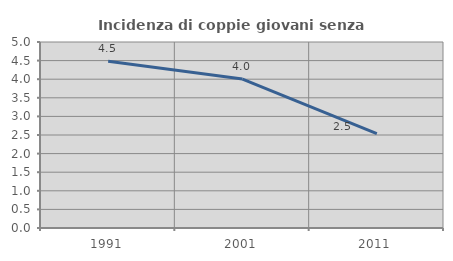
| Category | Incidenza di coppie giovani senza figli |
|---|---|
| 1991.0 | 4.484 |
| 2001.0 | 4.005 |
| 2011.0 | 2.54 |